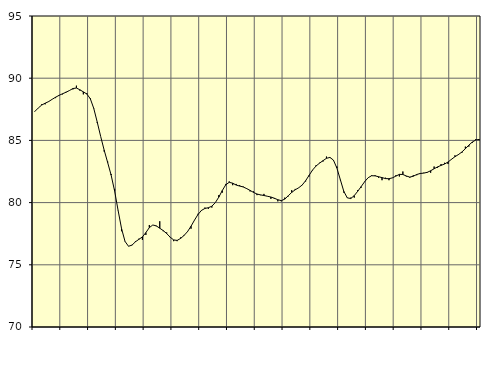
| Category | Piggar | Series 1 |
|---|---|---|
| nan | 87.3 | 87.32 |
| 87.0 | 87.6 | 87.6 |
| 87.0 | 87.9 | 87.84 |
| 87.0 | 87.9 | 87.99 |
| nan | 88.1 | 88.12 |
| 88.0 | 88.3 | 88.3 |
| 88.0 | 88.4 | 88.47 |
| 88.0 | 88.6 | 88.62 |
| nan | 88.7 | 88.75 |
| 89.0 | 88.9 | 88.87 |
| 89.0 | 89 | 89.01 |
| 89.0 | 89.1 | 89.17 |
| nan | 89.4 | 89.21 |
| 90.0 | 89 | 89.07 |
| 90.0 | 88.7 | 88.9 |
| 90.0 | 88.8 | 88.73 |
| nan | 88.4 | 88.35 |
| 91.0 | 87.6 | 87.57 |
| 91.0 | 86.4 | 86.47 |
| 91.0 | 85.3 | 85.3 |
| nan | 84.1 | 84.21 |
| 92.0 | 83.3 | 83.22 |
| 92.0 | 82.3 | 82.21 |
| 92.0 | 81.1 | 80.93 |
| nan | 79.4 | 79.38 |
| 93.0 | 77.7 | 77.91 |
| 93.0 | 76.9 | 76.88 |
| 93.0 | 76.5 | 76.49 |
| nan | 76.6 | 76.58 |
| 94.0 | 76.9 | 76.85 |
| 94.0 | 77.1 | 77.05 |
| 94.0 | 77 | 77.24 |
| nan | 77.4 | 77.59 |
| 95.0 | 78.2 | 77.99 |
| 95.0 | 78.2 | 78.2 |
| 95.0 | 78.1 | 78.13 |
| nan | 78.5 | 77.94 |
| 96.0 | 77.7 | 77.75 |
| 96.0 | 77.6 | 77.51 |
| 96.0 | 77.2 | 77.22 |
| nan | 76.9 | 77 |
| 97.0 | 76.9 | 76.96 |
| 97.0 | 77.2 | 77.12 |
| 97.0 | 77.4 | 77.36 |
| nan | 77.7 | 77.67 |
| 98.0 | 77.9 | 78.1 |
| 98.0 | 78.6 | 78.59 |
| 98.0 | 79.1 | 79.04 |
| nan | 79.4 | 79.37 |
| 99.0 | 79.6 | 79.53 |
| 99.0 | 79.5 | 79.59 |
| 99.0 | 79.6 | 79.71 |
| nan | 80 | 80 |
| 0.0 | 80.6 | 80.44 |
| 0.0 | 80.8 | 80.97 |
| 0.0 | 81.5 | 81.43 |
| nan | 81.7 | 81.63 |
| 1.0 | 81.4 | 81.56 |
| 1.0 | 81.5 | 81.41 |
| 1.0 | 81.4 | 81.33 |
| nan | 81.3 | 81.26 |
| 2.0 | 81.1 | 81.13 |
| 2.0 | 80.9 | 80.98 |
| 2.0 | 80.9 | 80.82 |
| nan | 80.6 | 80.69 |
| 3.0 | 80.6 | 80.62 |
| 3.0 | 80.7 | 80.57 |
| 3.0 | 80.5 | 80.51 |
| nan | 80.3 | 80.45 |
| 4.0 | 80.3 | 80.35 |
| 4.0 | 80.1 | 80.23 |
| 4.0 | 80.1 | 80.16 |
| nan | 80.4 | 80.28 |
| 5.0 | 80.5 | 80.55 |
| 5.0 | 81 | 80.82 |
| 5.0 | 81.1 | 81.03 |
| nan | 81.2 | 81.19 |
| 6.0 | 81.4 | 81.41 |
| 6.0 | 81.7 | 81.76 |
| 6.0 | 82.1 | 82.19 |
| nan | 82.6 | 82.62 |
| 7.0 | 83 | 82.94 |
| 7.0 | 83.2 | 83.17 |
| 7.0 | 83.3 | 83.37 |
| nan | 83.7 | 83.56 |
| 8.0 | 83.6 | 83.63 |
| 8.0 | 83.4 | 83.42 |
| 8.0 | 82.9 | 82.78 |
| nan | 81.8 | 81.84 |
| 9.0 | 80.8 | 80.9 |
| 9.0 | 80.4 | 80.38 |
| 9.0 | 80.4 | 80.33 |
| nan | 80.4 | 80.56 |
| 10.0 | 81 | 80.91 |
| 10.0 | 81.2 | 81.29 |
| 10.0 | 81.7 | 81.68 |
| nan | 82 | 82 |
| 11.0 | 82.2 | 82.16 |
| 11.0 | 82.2 | 82.15 |
| 11.0 | 82 | 82.08 |
| nan | 81.8 | 82.01 |
| 12.0 | 82 | 81.93 |
| 12.0 | 81.8 | 81.92 |
| 12.0 | 82 | 81.99 |
| nan | 82.2 | 82.13 |
| 13.0 | 82.1 | 82.27 |
| 13.0 | 82.5 | 82.26 |
| 13.0 | 82.1 | 82.14 |
| nan | 82 | 82.05 |
| 14.0 | 82.2 | 82.12 |
| 14.0 | 82.2 | 82.26 |
| 14.0 | 82.3 | 82.34 |
| nan | 82.4 | 82.37 |
| 15.0 | 82.4 | 82.43 |
| 15.0 | 82.4 | 82.56 |
| 15.0 | 82.9 | 82.72 |
| nan | 82.8 | 82.87 |
| 16.0 | 83.1 | 82.99 |
| 16.0 | 83.2 | 83.1 |
| 16.0 | 83.1 | 83.26 |
| nan | 83.5 | 83.48 |
| 17.0 | 83.8 | 83.69 |
| 17.0 | 83.9 | 83.86 |
| 17.0 | 84 | 84.07 |
| nan | 84.5 | 84.33 |
| 18.0 | 84.5 | 84.62 |
| 18.0 | 84.8 | 84.87 |
| 18.0 | 85.1 | 85.03 |
| nan | 85 | 85.08 |